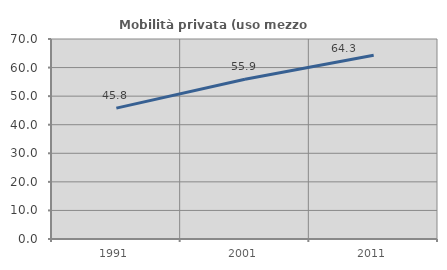
| Category | Mobilità privata (uso mezzo privato) |
|---|---|
| 1991.0 | 45.804 |
| 2001.0 | 55.922 |
| 2011.0 | 64.308 |